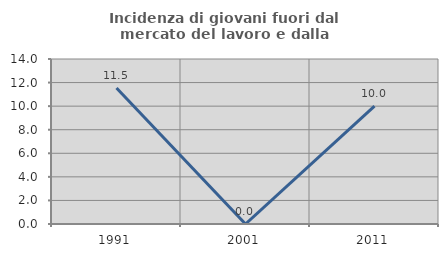
| Category | Incidenza di giovani fuori dal mercato del lavoro e dalla formazione  |
|---|---|
| 1991.0 | 11.538 |
| 2001.0 | 0 |
| 2011.0 | 10 |